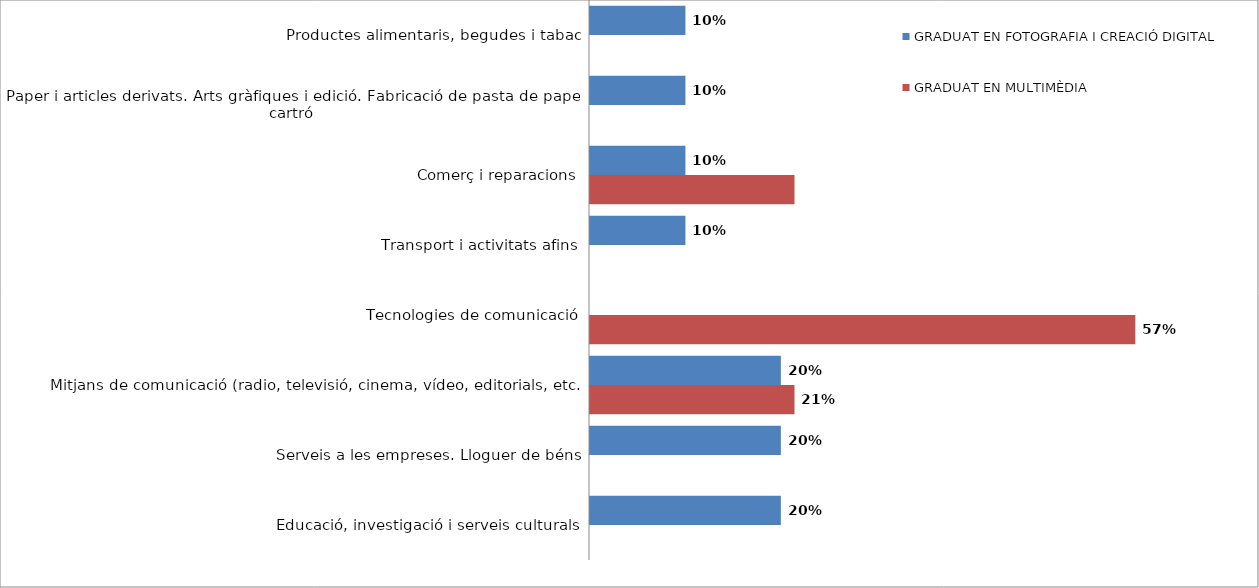
| Category | GRADUAT EN FOTOGRAFIA I CREACIÓ DIGITAL | GRADUAT EN MULTIMÈDIA |
|---|---|---|
| Productes alimentaris, begudes i tabac | 0.1 | 0 |
| Paper i articles derivats. Arts gràfiques i edició. Fabricació de pasta de paper, cartró | 0.1 | 0 |
| Comerç i reparacions | 0.1 | 0.214 |
| Transport i activitats afins | 0.1 | 0 |
| Tecnologies de comunicació | 0 | 0.571 |
| Mitjans de comunicació (radio, televisió, cinema, vídeo, editorials, etc.) | 0.2 | 0.214 |
| Serveis a les empreses. Lloguer de béns | 0.2 | 0 |
| Educació, investigació i serveis culturals | 0.2 | 0 |